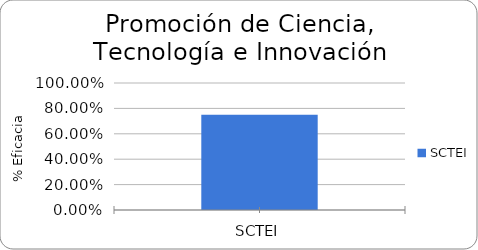
| Category | % Eficacia total |
|---|---|
| SCTEI | 0.75 |